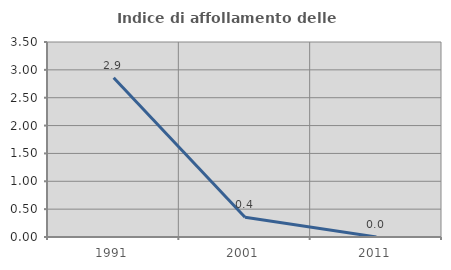
| Category | Indice di affollamento delle abitazioni  |
|---|---|
| 1991.0 | 2.857 |
| 2001.0 | 0.355 |
| 2011.0 | 0 |